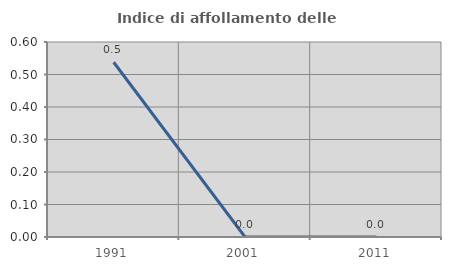
| Category | Indice di affollamento delle abitazioni  |
|---|---|
| 1991.0 | 0.538 |
| 2001.0 | 0 |
| 2011.0 | 0 |